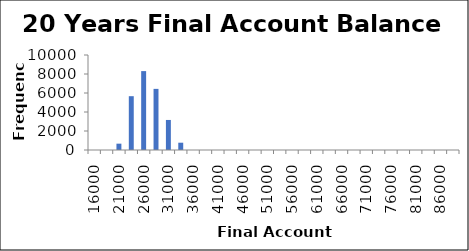
| Category | Frequency |
|---|---|
| 16000.0 | 0 |
| 18500.0 | 0 |
| 21000.0 | 667 |
| 23500.0 | 5664 |
| 26000.0 | 8305 |
| 28500.0 | 6434 |
| 31000.0 | 3162 |
| 33500.0 | 768 |
| 36000.0 | 0 |
| 38500.0 | 0 |
| 41000.0 | 0 |
| 43500.0 | 0 |
| 46000.0 | 0 |
| 48500.0 | 0 |
| 51000.0 | 0 |
| 53500.0 | 0 |
| 56000.0 | 0 |
| 58500.0 | 0 |
| 61000.0 | 0 |
| 63500.0 | 0 |
| 66000.0 | 0 |
| 68500.0 | 0 |
| 71000.0 | 0 |
| 73500.0 | 0 |
| 76000.0 | 0 |
| 78500.0 | 0 |
| 81000.0 | 0 |
| 83500.0 | 0 |
| 86000.0 | 0 |
| More | 0 |